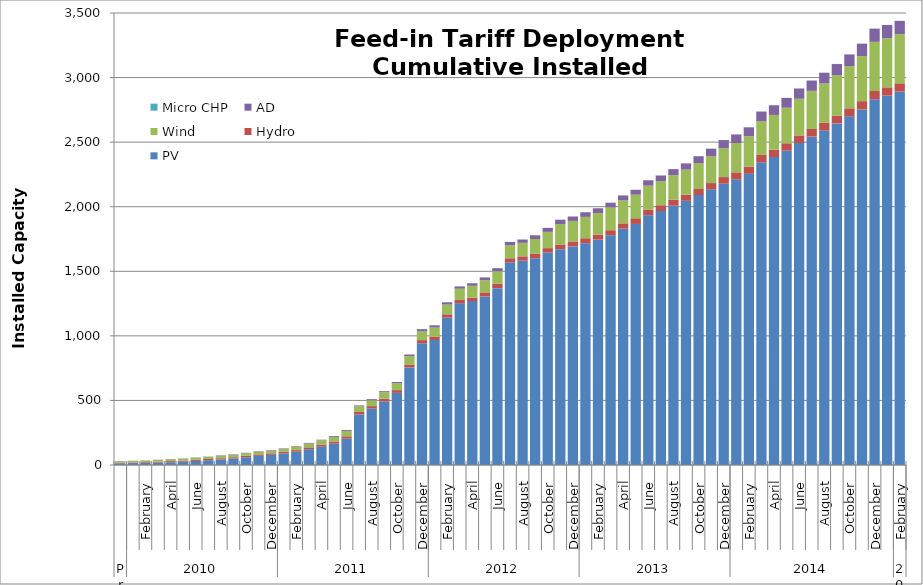
| Category | PV | Hydro | Wind | AD | Micro CHP |
|---|---|---|---|---|---|
| 0 | 13.818 | 4.716 | 11.07 | 1.103 | 0 |
| 1 | 14.999 | 4.764 | 12.022 | 1.103 | 0 |
| 2 | 16.382 | 5.951 | 12.403 | 1.103 | 0 |
| 3 | 18.903 | 6.692 | 14.044 | 1.463 | 0 |
| 4 | 21.541 | 8.692 | 14.314 | 1.463 | 0 |
| 5 | 25.844 | 8.692 | 14.997 | 1.463 | 0 |
| 6 | 31.412 | 9.187 | 16.425 | 1.633 | 0.006 |
| 7 | 37.314 | 9.252 | 17.16 | 1.721 | 0.016 |
| 8 | 43.109 | 9.352 | 17.742 | 3.851 | 0.025 |
| 9 | 50.639 | 9.406 | 18.373 | 3.851 | 0.038 |
| 10 | 60.011 | 11.453 | 19.317 | 3.851 | 0.055 |
| 11 | 70.595 | 11.489 | 20.153 | 3.851 | 0.091 |
| 12 | 78.623 | 11.497 | 21.505 | 3.851 | 0.124 |
| 13 | 89.818 | 12.367 | 22.097 | 4.041 | 0.151 |
| 14 | 102.746 | 12.382 | 26.717 | 4.041 | 0.193 |
| 15 | 122.551 | 14.307 | 29.386 | 4.73 | 0.238 |
| 16 | 141.713 | 15.373 | 33.253 | 5.23 | 0.264 |
| 17 | 165.229 | 17.101 | 35.089 | 6.529 | 0.291 |
| 18 | 203.994 | 18.138 | 41.792 | 6.889 | 0.31 |
| 19 | 391.772 | 19.133 | 43.551 | 6.889 | 0.33 |
| 20 | 436.521 | 19.401 | 45.368 | 8.554 | 0.355 |
| 21 | 492.932 | 21.249 | 49.002 | 8.554 | 0.396 |
| 22 | 558.208 | 21.781 | 52.463 | 10.124 | 0.426 |
| 23 | 755.308 | 23.412 | 63.705 | 12.954 | 0.442 |
| 24 | 942.934 | 23.983 | 68.263 | 16.719 | 0.454 |
| 25 | 967.364 | 25.492 | 71.275 | 17.718 | 0.459 |
| 26 | 1140.941 | 25.843 | 75.741 | 17.718 | 0.464 |
| 27 | 1251.647 | 26.909 | 86.438 | 17.718 | 0.474 |
| 28 | 1269.071 | 27.551 | 90.996 | 19.678 | 0.482 |
| 29 | 1305.093 | 31.531 | 93.459 | 22.633 | 0.497 |
| 30 | 1369.519 | 33.172 | 98.284 | 23.195 | 0.514 |
| 31 | 1567.342 | 33.589 | 100.945 | 25.097 | 0.52 |
| 32 | 1582.154 | 33.589 | 104.605 | 25.596 | 0.524 |
| 33 | 1600.939 | 33.832 | 115.4 | 28.581 | 0.534 |
| 34 | 1645.123 | 34.201 | 125.883 | 30.547 | 0.55 |
| 35 | 1671.046 | 36.626 | 158.476 | 32.925 | 0.566 |
| 36 | 1692.437 | 38.774 | 158.787 | 34.165 | 0.574 |
| 37 | 1717.161 | 38.824 | 165.312 | 35.863 | 0.586 |
| 38 | 1744.912 | 39.136 | 167.349 | 36.622 | 0.59 |
| 39 | 1778.569 | 39.705 | 175.437 | 37.121 | 0.594 |
| 40 | 1829.772 | 41.41 | 177.913 | 38 | 0.599 |
| 41 | 1866.649 | 44.054 | 182.339 | 38 | 0.599 |
| 42 | 1933.818 | 44.748 | 184.688 | 41.688 | 0.6 |
| 43 | 1966.844 | 44.85 | 186.927 | 42.991 | 0.602 |
| 44 | 2007.457 | 46.043 | 190.912 | 46.789 | 0.602 |
| 45 | 2045.756 | 46.515 | 194.89 | 48.285 | 0.602 |
| 46 | 2090.27 | 46.954 | 199.815 | 54.104 | 0.604 |
| 47 | 2134.633 | 48.458 | 207.089 | 59.022 | 0.609 |
| 48 | 2177.967 | 51.423 | 222.886 | 63.899 | 0.613 |
| 49 | 2212.064 | 54.155 | 226.996 | 66.277 | 0.618 |
| 50 | 2254.617 | 54.952 | 235.975 | 69.334 | 0.621 |
| 51 | 2344.052 | 56.75 | 261.514 | 74.578 | 0.628 |
| 52 | 2384.963 | 56.84 | 269.022 | 74.828 | 0.628 |
| 53 | 2433.492 | 57.965 | 275.097 | 75.826 | 0.628 |
| 54 | 2493.362 | 58.691 | 283.855 | 79.523 | 0.628 |
| 55 | 2542.578 | 59.001 | 295.651 | 79.623 | 0.63 |
| 56 | 2589.258 | 60.144 | 305.115 | 82.842 | 0.632 |
| 57 | 2645.304 | 60.477 | 313.189 | 85.786 | 0.634 |
| 58 | 2699.564 | 62.419 | 327.293 | 89.786 | 0.641 |
| 59 | 2753.026 | 64.341 | 348.928 | 95.963 | 0.644 |
| 60 | 2831.746 | 64.455 | 380.471 | 102.084 | 0.646 |
| 61 | 2859.916 | 64.507 | 380.471 | 102.084 | 0.657 |
| 62 | 2891.146 | 64.507 | 380.833 | 102.084 | 0.664 |